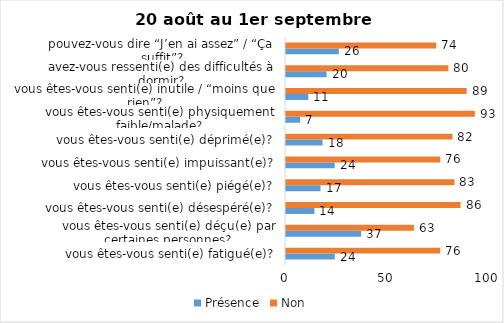
| Category | Présence | Non |
|---|---|---|
| vous êtes-vous senti(e) fatigué(e)? | 24 | 76 |
| vous êtes-vous senti(e) déçu(e) par certaines personnes? | 37 | 63 |
| vous êtes-vous senti(e) désespéré(e)? | 14 | 86 |
| vous êtes-vous senti(e) piégé(e)? | 17 | 83 |
| vous êtes-vous senti(e) impuissant(e)? | 24 | 76 |
| vous êtes-vous senti(e) déprimé(e)? | 18 | 82 |
| vous êtes-vous senti(e) physiquement faible/malade? | 7 | 93 |
| vous êtes-vous senti(e) inutile / “moins que rien”? | 11 | 89 |
| avez-vous ressenti(e) des difficultés à dormir? | 20 | 80 |
| pouvez-vous dire “J’en ai assez” / “Ça suffit”? | 26 | 74 |